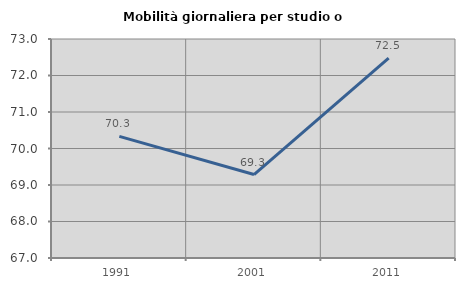
| Category | Mobilità giornaliera per studio o lavoro |
|---|---|
| 1991.0 | 70.332 |
| 2001.0 | 69.286 |
| 2011.0 | 72.479 |